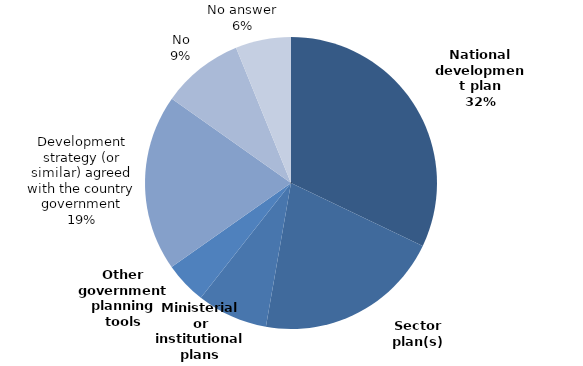
| Category | Series 0 |
|---|---|
| National development plan | 0.321 |
| Sector plan(s) | 0.206 |
| Ministerial or institutional plans | 0.078 |
| Other government planning tools | 0.046 |
| Development strategy (or similar) agreed with the country government | 0.195 |
| No | 0.09 |
| No answer | 0.061 |